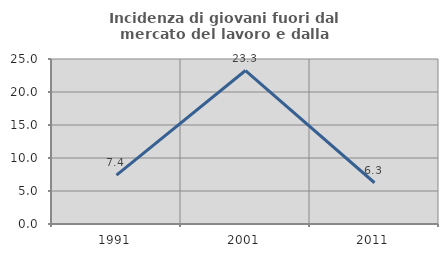
| Category | Incidenza di giovani fuori dal mercato del lavoro e dalla formazione  |
|---|---|
| 1991.0 | 7.407 |
| 2001.0 | 23.256 |
| 2011.0 | 6.25 |